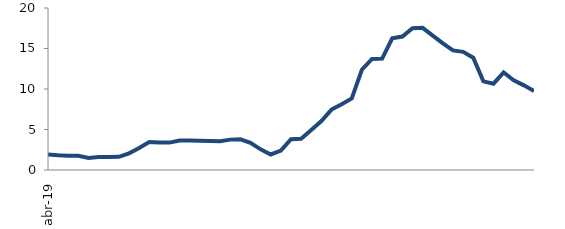
| Category | Series 0 |
|---|---|
| 2019-04-01 | 1.902 |
| 2019-05-01 | 1.814 |
| 2019-06-01 | 1.756 |
| 2019-07-01 | 1.75 |
| 2019-08-01 | 1.495 |
| 2019-09-01 | 1.596 |
| 2019-10-01 | 1.597 |
| 2019-11-01 | 1.624 |
| 2019-12-01 | 2.057 |
| 2020-01-01 | 2.71 |
| 2020-02-01 | 3.453 |
| 2020-03-01 | 3.382 |
| 2020-04-01 | 3.383 |
| 2020-05-01 | 3.648 |
| 2020-06-01 | 3.638 |
| 2020-07-01 | 3.61 |
| 2020-08-01 | 3.571 |
| 2020-09-01 | 3.559 |
| 2020-10-01 | 3.75 |
| 2020-11-01 | 3.789 |
| 2020-12-01 | 3.346 |
| 2021-01-01 | 2.551 |
| 2021-02-01 | 1.916 |
| 2021-03-01 | 2.39 |
| 2021-04-01 | 3.807 |
| 2021-05-01 | 3.85 |
| 2021-06-01 | 4.942 |
| 2021-07-01 | 6.041 |
| 2021-08-01 | 7.459 |
| 2021-09-01 | 8.119 |
| 2021-10-01 | 8.829 |
| 2021-11-01 | 12.381 |
| 2021-12-01 | 13.709 |
| 2022-01-01 | 13.747 |
| 2022-02-01 | 16.254 |
| 2022-03-01 | 16.473 |
| 2022-04-01 | 17.493 |
| 2022-05-01 | 17.552 |
| 2022-06-01 | 16.588 |
| 2022-07-01 | 15.631 |
| 2022-08-01 | 14.77 |
| 2022-09-01 | 14.59 |
| 2022-10-01 | 13.87 |
| 2022-11-01 | 10.941 |
| 2022-12-01 | 10.654 |
| 2023-01-01 | 12.036 |
| 2023-02-01 | 11.079 |
| 2023-03-01 | 10.449 |
| 2023-04-01 | 9.756 |